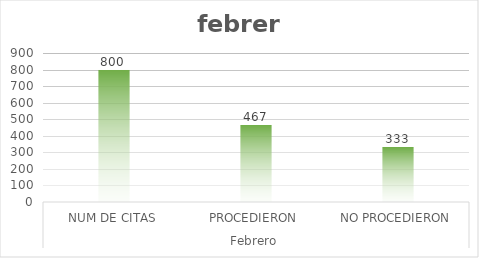
| Category | Series 0 |
|---|---|
| 0 | 800 |
| 1 | 467 |
| 2 | 333 |